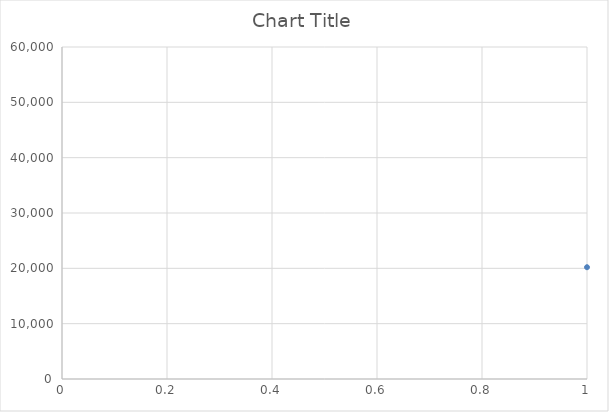
| Category | Series 0 |
|---|---|
| 0 | 20200 |
| 1 | 32600 |
| 2 | 33800 |
| 3 | 31000 |
| 4 | 32000 |
| 5 | 31800 |
| 6 | 30800 |
| 7 | 31200 |
| 8 | 30400 |
| 9 | 42500 |
| 10 | 43000 |
| 11 | 20000 |
| 12 | 32200 |
| 13 | 31600 |
| 14 | 32600 |
| 15 | 32000 |
| 16 | 32000 |
| 17 | 31800 |
| 18 | 31800 |
| 19 | 31200 |
| 20 | 41000 |
| 21 | 41500 |
| 22 | 9800 |
| 23 | 13000 |
| 24 | 19000 |
| 25 | 18000 |
| 26 | 24000 |
| 27 | 12200 |
| 28 | 9000 |
| 29 | 25000 |
| 30 | 9800 |
| 31 | 12000 |
| 32 | 18000 |
| 33 | 9800 |
| 34 | 23800 |
| 35 | 24000 |
| 36 | 35738 |
| 37 | 35404 |
| 38 | 46500 |
| 39 | 33400 |
| 40 | 45500 |
| 41 | 55500 |
| 42 | 23600 |
| 43 | 33400 |
| 44 | 35738 |
| 45 | 24000 |
| 46 | 35404 |
| 47 | 23800 |
| 48 | 46500 |
| 49 | 33400 |
| 50 | 55500 |
| 51 | 55500 |
| 52 | 23600 |
| 53 | 45500 |
| 54 | 45500 |
| 55 | 23600 |
| 56 | 33400 |
| 57 | 33400 |
| 58 | 23000 |
| 59 | 28000 |
| 60 | 23000 |
| 61 | 48000 |
| 62 | 48000 |
| 63 | 19000 |
| 64 | 24000 |
| 65 | 19000 |
| 66 | 36000 |
| 67 | 18000 |
| 68 | 18000 |
| 69 | 36000 |
| 70 | 18000 |
| 71 | 10900 |
| 72 | 11800 |
| 73 | 28000 |
| 74 | 24000 |
| 75 | 9000 |
| 76 | 13000 |
| 77 | 19000 |
| 78 | 18000 |
| 79 | 10900 |
| 80 | 11800 |
| 81 | 13500 |
| 82 | 16200 |
| 83 | 10000 |
| 84 | 21600 |
| 85 | 18000 |
| 86 | 18940 |
| 87 | 16000 |
| 88 | 25400 |
| 89 | 18900 |
| 90 | 12000 |
| 91 | 21600 |
| 92 | 18056 |
| 93 | 18000 |
| 94 | 10089 |
| 95 | 13679 |
| 96 | 12000 |
| 97 | 14400 |
| 98 | 24000 |
| 99 | 18295 |
| 100 | 10942 |
| 101 | 24000 |
| 102 | 8806.37 |
| 103 | 13000 |
| 104 | 11000 |
| 105 | 23250 |
| 106 | 24000 |
| 107 | 10800 |
| 108 | 13300 |
| 109 | 27000 |
| 110 | 13600 |
| 111 | 22000 |
| 112 | 25000 |
| 113 | 36400 |
| 114 | 21600 |
| 115 | 21600 |
| 116 | 18000 |
| 117 | 18000 |
| 118 | 16000 |
| 119 | 16000 |
| 120 | 16000 |
| 121 | 16000 |
| 122 | 12000 |
| 123 | 16000 |
| 124 | 12000 |
| 125 | 12000 |
| 126 | 12000 |
| 127 | 12000 |
| 128 | 18000 |
| 129 | 18000 |
| 130 | 18000 |
| 131 | 18000 |
| 132 | 16000 |
| 133 | 16000 |
| 134 | 16000 |
| 135 | 12000 |
| 136 | 12000 |
| 137 | 16000 |
| 138 | 12000 |
| 139 | 12000 |
| 140 | 36400 |
| 141 | 21600 |
| 142 | 21600 |
| 143 | 42000 |
| 144 | 54000 |
| 145 | 12000 |
| 146 | 12000 |
| 147 | 24000 |
| 148 | 9800 |
| 149 | 18000 |
| 150 | 25000 |
| 151 | 10000 |
| 152 | 10000 |
| 153 | 12000 |
| 154 | 12000 |
| 155 | 12000 |
| 156 | 12000 |
| 157 | 12000 |
| 158 | 25000 |
| 159 | 25000 |
| 160 | 48000 |
| 161 | 19000 |
| 162 | 28000 |
| 163 | 18000 |
| 164 | 18000 |
| 165 | 18000 |
| 166 | 18000 |
| 167 | 28000 |
| 168 | 10900 |
| 169 | 10000 |
| 170 | 10000 |
| 171 | 12000 |
| 172 | 12000 |
| 173 | 24400 |
| 174 | 24400 |
| 175 | 18000 |
| 176 | 36000 |
| 177 | 10000 |
| 178 | 24400 |
| 179 | 9800 |
| 180 | 9800 |
| 181 | 24000 |
| 182 | 24000 |
| 183 | 12000 |
| 184 | 12000 |
| 185 | 10900 |
| 186 | 11000 |
| 187 | 10900 |
| 188 | 24000 |
| 189 | 25000 |
| 190 | 25000 |
| 191 | 24000 |
| 192 | 11800 |
| 193 | 11800 |
| 194 | 12000 |
| 195 | 18000 |
| 196 | 24000 |
| 197 | 12200 |
| 198 | 9000 |
| 199 | 9000 |
| 200 | 12600 |
| 201 | 27700 |
| 202 | 20400 |
| 203 | 16000 |
| 204 | 22000 |
| 205 | 10000 |
| 206 | 16500 |
| 207 | 12000 |
| 208 | 9000 |
| 209 | 13000 |
| 210 | 19000 |
| 211 | 9000 |
| 212 | 13000 |
| 213 | 19000 |
| 214 | 9000 |
| 215 | 13000 |
| 216 | 19000 |
| 217 | 9000 |
| 218 | 13000 |
| 219 | 19000 |
| 220 | 9000 |
| 221 | 13000 |
| 222 | 19000 |
| 223 | 9000 |
| 224 | 13000 |
| 225 | 19000 |
| 226 | 9000 |
| 227 | 13000 |
| 228 | 19000 |
| 229 | 12000 |
| 230 | 12000 |
| 231 | 12000 |
| 232 | 24000 |
| 233 | 24000 |
| 234 | 28000 |
| 235 | 10900 |
| 236 | 10900 |
| 237 | 36000 |
| 238 | 32000 |
| 239 | 36000 |
| 240 | 54000 |
| 241 | 20000 |
| 242 | 23250 |
| 243 | 27600 |
| 244 | 24000 |
| 245 | 10800 |
| 246 | 10800 |
| 247 | 13300 |
| 248 | 13300 |
| 249 | 27000 |
| 250 | 11000 |
| 251 | 12000 |
| 252 | 22000 |
| 253 | 18000 |
| 254 | 38000 |
| 255 | 25000 |
| 256 | 25000 |
| 257 | 10900 |
| 258 | 21600 |
| 259 | 13600 |
| 260 | 45000 |
| 261 | 28600 |
| 262 | 28600 |
| 263 | 48000 |
| 264 | 20300 |
| 265 | 45000 |
| 266 | 21000 |
| 267 | 13600 |
| 268 | 18000 |
| 269 | 18000 |
| 270 | 20300 |
| 271 | 13000 |
| 272 | 13600 |
| 273 | 8700 |
| 274 | 10900 |
| 275 | 11000 |
| 276 | 10900 |
| 277 | 8700 |
| 278 | 22400 |
| 279 | 34400 |
| 280 | 21600 |
| 281 | 9000 |
| 282 | 11500 |
| 283 | 26000 |
| 284 | 12000 |
| 285 | 13800 |
| 286 | 18000 |
| 287 | 13600 |
| 288 | 10900 |
| 289 | 12000 |
| 290 | 32000 |
| 291 | 12000 |
| 292 | 11000 |
| 293 | 14000 |
| 294 | 32000 |
| 295 | 12000 |
| 296 | 27000 |
| 297 | 13600 |
| 298 | 12600 |
| 299 | 10800 |
| 300 | 18000 |
| 301 | 20200 |
| 302 | 20200 |
| 303 | 32600 |
| 304 | 33800 |
| 305 | 31000 |
| 306 | 32000 |
| 307 | 31800 |
| 308 | 30800 |
| 309 | 31200 |
| 310 | 30400 |
| 311 | 42500 |
| 312 | 43000 |
| 313 | 20000 |
| 314 | 32200 |
| 315 | 31600 |
| 316 | 32600 |
| 317 | 32000 |
| 318 | 32000 |
| 319 | 31800 |
| 320 | 31800 |
| 321 | 31200 |
| 322 | 41000 |
| 323 | 41500 |
| 324 | 9800 |
| 325 | 13000 |
| 326 | 19000 |
| 327 | 18000 |
| 328 | 24000 |
| 329 | 12200 |
| 330 | 9000 |